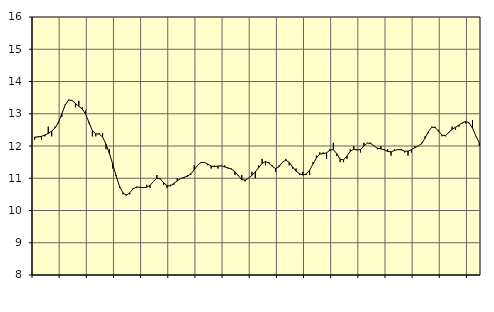
| Category | Piggar | Handel, SNI 45-47 |
|---|---|---|
| nan | 12.2 | 12.28 |
| 87.0 | 12.3 | 12.28 |
| 87.0 | 12.2 | 12.3 |
| 87.0 | 12.3 | 12.34 |
| nan | 12.6 | 12.39 |
| 88.0 | 12.3 | 12.46 |
| 88.0 | 12.6 | 12.56 |
| 88.0 | 12.7 | 12.74 |
| nan | 12.9 | 13 |
| 89.0 | 13.3 | 13.27 |
| 89.0 | 13.4 | 13.43 |
| 89.0 | 13.4 | 13.41 |
| nan | 13.2 | 13.32 |
| 90.0 | 13.4 | 13.23 |
| 90.0 | 13.2 | 13.15 |
| 90.0 | 13.1 | 12.99 |
| nan | 12.7 | 12.73 |
| 91.0 | 12.3 | 12.47 |
| 91.0 | 12.3 | 12.38 |
| 91.0 | 12.4 | 12.37 |
| nan | 12.4 | 12.28 |
| 92.0 | 11.9 | 12.06 |
| 92.0 | 11.9 | 11.77 |
| 92.0 | 11.3 | 11.44 |
| nan | 11.1 | 11.07 |
| 93.0 | 10.7 | 10.75 |
| 93.0 | 10.5 | 10.55 |
| 93.0 | 10.5 | 10.47 |
| nan | 10.5 | 10.55 |
| 94.0 | 10.7 | 10.67 |
| 94.0 | 10.7 | 10.73 |
| 94.0 | 10.7 | 10.72 |
| nan | 10.7 | 10.71 |
| 95.0 | 10.8 | 10.72 |
| 95.0 | 10.7 | 10.78 |
| 95.0 | 10.9 | 10.9 |
| nan | 11.1 | 11 |
| 96.0 | 11 | 10.98 |
| 96.0 | 10.8 | 10.86 |
| 96.0 | 10.7 | 10.77 |
| nan | 10.8 | 10.76 |
| 97.0 | 10.8 | 10.84 |
| 97.0 | 11 | 10.92 |
| 97.0 | 11 | 10.99 |
| nan | 11 | 11.03 |
| 98.0 | 11.1 | 11.06 |
| 98.0 | 11.1 | 11.14 |
| 98.0 | 11.4 | 11.26 |
| nan | 11.4 | 11.4 |
| 99.0 | 11.5 | 11.49 |
| 99.0 | 11.5 | 11.49 |
| 99.0 | 11.4 | 11.44 |
| nan | 11.3 | 11.38 |
| 0.0 | 11.4 | 11.36 |
| 0.0 | 11.3 | 11.38 |
| 0.0 | 11.4 | 11.38 |
| nan | 11.4 | 11.35 |
| 1.0 | 11.3 | 11.32 |
| 1.0 | 11.3 | 11.28 |
| 1.0 | 11.1 | 11.2 |
| nan | 11.1 | 11.08 |
| 2.0 | 11.1 | 10.96 |
| 2.0 | 10.9 | 10.94 |
| 2.0 | 11 | 11 |
| nan | 11.2 | 11.09 |
| 3.0 | 11 | 11.2 |
| 3.0 | 11.4 | 11.33 |
| 3.0 | 11.6 | 11.46 |
| nan | 11.4 | 11.52 |
| 4.0 | 11.5 | 11.47 |
| 4.0 | 11.4 | 11.37 |
| 4.0 | 11.2 | 11.3 |
| nan | 11.4 | 11.36 |
| 5.0 | 11.5 | 11.5 |
| 5.0 | 11.6 | 11.56 |
| 5.0 | 11.4 | 11.49 |
| nan | 11.3 | 11.35 |
| 6.0 | 11.3 | 11.22 |
| 6.0 | 11.1 | 11.14 |
| 6.0 | 11.2 | 11.1 |
| nan | 11.1 | 11.13 |
| 7.0 | 11.1 | 11.25 |
| 7.0 | 11.5 | 11.44 |
| 7.0 | 11.7 | 11.63 |
| nan | 11.8 | 11.75 |
| 8.0 | 11.8 | 11.76 |
| 8.0 | 11.6 | 11.79 |
| 8.0 | 11.9 | 11.87 |
| nan | 12.1 | 11.89 |
| 9.0 | 11.7 | 11.76 |
| 9.0 | 11.5 | 11.59 |
| 9.0 | 11.5 | 11.57 |
| nan | 11.6 | 11.69 |
| 10.0 | 11.9 | 11.84 |
| 10.0 | 12 | 11.9 |
| 10.0 | 11.9 | 11.88 |
| nan | 11.8 | 11.89 |
| 11.0 | 12.1 | 12 |
| 11.0 | 12.1 | 12.09 |
| 11.0 | 12.1 | 12.08 |
| nan | 12 | 12 |
| 12.0 | 11.9 | 11.93 |
| 12.0 | 12 | 11.91 |
| 12.0 | 11.9 | 11.88 |
| nan | 11.9 | 11.83 |
| 13.0 | 11.7 | 11.82 |
| 13.0 | 11.9 | 11.86 |
| 13.0 | 11.9 | 11.89 |
| nan | 11.9 | 11.88 |
| 14.0 | 11.8 | 11.84 |
| 14.0 | 11.7 | 11.84 |
| 14.0 | 11.8 | 11.89 |
| nan | 12 | 11.95 |
| 15.0 | 12 | 12 |
| 15.0 | 12.1 | 12.07 |
| 15.0 | 12.3 | 12.24 |
| nan | 12.4 | 12.45 |
| 16.0 | 12.6 | 12.58 |
| 16.0 | 12.6 | 12.57 |
| 16.0 | 12.5 | 12.46 |
| nan | 12.3 | 12.34 |
| 17.0 | 12.3 | 12.32 |
| 17.0 | 12.4 | 12.42 |
| 17.0 | 12.6 | 12.52 |
| nan | 12.5 | 12.58 |
| 18.0 | 12.6 | 12.65 |
| 18.0 | 12.7 | 12.72 |
| 18.0 | 12.7 | 12.76 |
| nan | 12.7 | 12.72 |
| 19.0 | 12.8 | 12.55 |
| 19.0 | 12.3 | 12.31 |
| 19.0 | 12 | 12.1 |